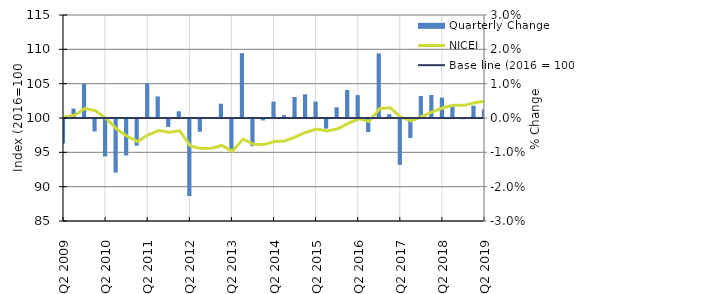
| Category | Quarterly Change |
|---|---|
| Q2 2009 | -0.007 |
|  | 0.003 |
|  | 0.01 |
|  | -0.004 |
| Q2 2010 | -0.011 |
|  | -0.016 |
|  | -0.011 |
|  | -0.008 |
| Q2 2011 | 0.01 |
|  | 0.006 |
|  | -0.002 |
|  | 0.002 |
| Q2 2012 | -0.022 |
|  | -0.004 |
|  | 0 |
|  | 0.004 |
| Q2 2013 | -0.009 |
|  | 0.019 |
|  | -0.008 |
|  | 0 |
| Q2 2014 | 0.005 |
|  | 0.001 |
|  | 0.006 |
|  | 0.007 |
| Q2 2015 | 0.005 |
|  | -0.003 |
|  | 0.003 |
|  | 0.008 |
| Q2 2016 | 0.007 |
|  | -0.004 |
|  | 0.019 |
|  | 0.001 |
| Q2 2017 | -0.013 |
|  | -0.006 |
|  | 0.006 |
|  | 0.007 |
| Q2 2018 | 0.006 |
|  | 0.004 |
|  | 0 |
|  | 0.004 |
| Q2 2019 | 0.003 |